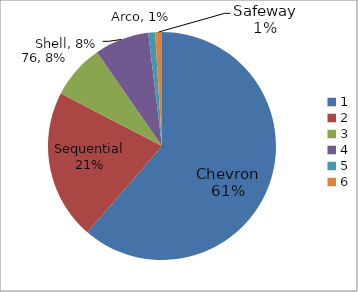
| Category | Series 0 |
|---|---|
| 0 | 127 |
| 1 | 44 |
| 2 | 16 |
| 3 | 16 |
| 4 | 2 |
| 5 | 2 |